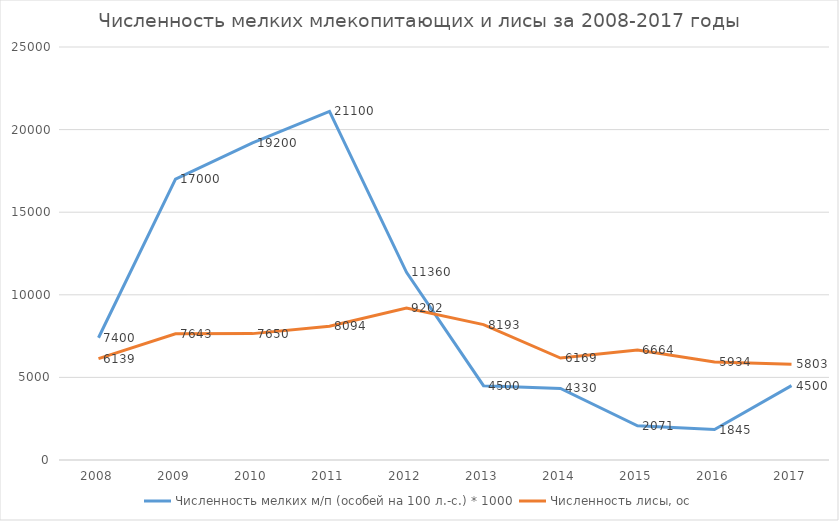
| Category | Численность мелких м/п (особей на 100 л.-с.) * 1000 | Численность лисы, ос |
|---|---|---|
| 2008.0 | 7400 | 6139 |
| 2009.0 | 17000 | 7643 |
| 2010.0 | 19200 | 7650 |
| 2011.0 | 21100 | 8094 |
| 2012.0 | 11360 | 9202 |
| 2013.0 | 4500 | 8193 |
| 2014.0 | 4330 | 6169 |
| 2015.0 | 2071 | 6664 |
| 2016.0 | 1845 | 5934 |
| 2017.0 | 4500 | 5803 |